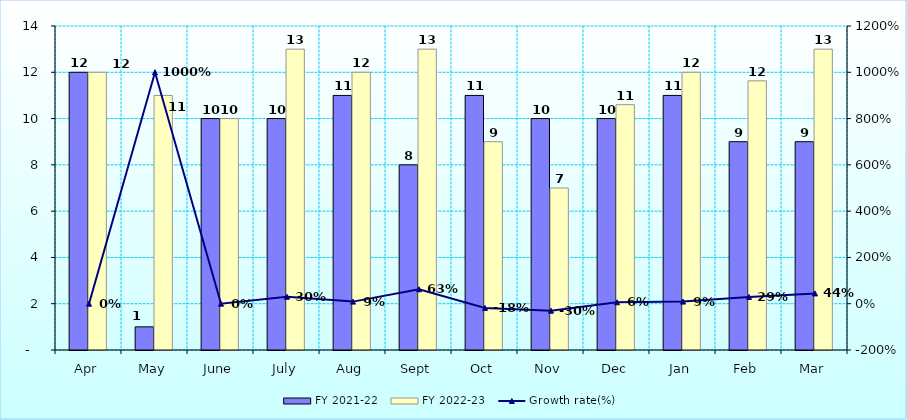
| Category | FY 2021-22 | FY 2022-23 |
|---|---|---|
| Apr | 12 | 12 |
| May | 1 | 11 |
| June | 10 | 10 |
| July | 10 | 13 |
| Aug | 11 | 12 |
| Sept | 8 | 13 |
| Oct | 11 | 9 |
| Nov | 10 | 7 |
| Dec | 10 | 10.6 |
| Jan | 11 | 12 |
| Feb | 9 | 11.629 |
| Mar | 9 | 13 |